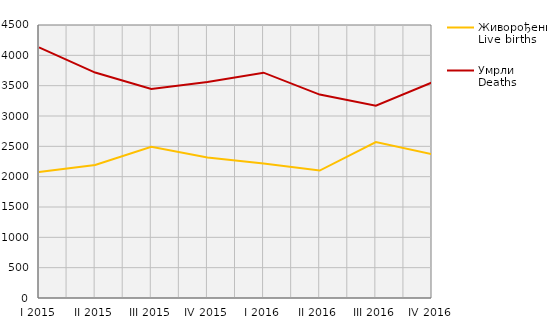
| Category | Живорођени
Live births | Умрли
Deaths |
|---|---|---|
| I 2015 | 2078 | 4132 |
| II 2015 | 2194 | 3716 |
| III 2015 | 2492 | 3444 |
| IV 2015 | 2315 | 3560 |
| I 2016 | 2216 | 3714 |
| II 2016 | 2101 | 3353 |
| III 2016 | 2570 | 3171 |
| IV 2016 | 2369 | 3552 |